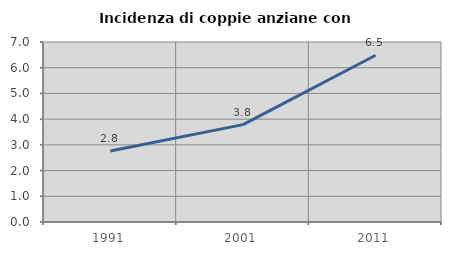
| Category | Incidenza di coppie anziane con figli |
|---|---|
| 1991.0 | 2.759 |
| 2001.0 | 3.787 |
| 2011.0 | 6.486 |